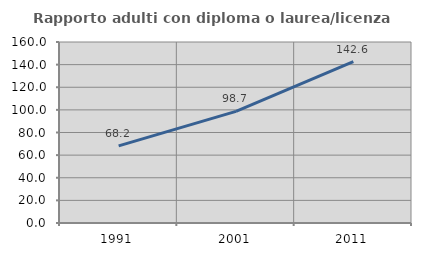
| Category | Rapporto adulti con diploma o laurea/licenza media  |
|---|---|
| 1991.0 | 68.163 |
| 2001.0 | 98.671 |
| 2011.0 | 142.6 |